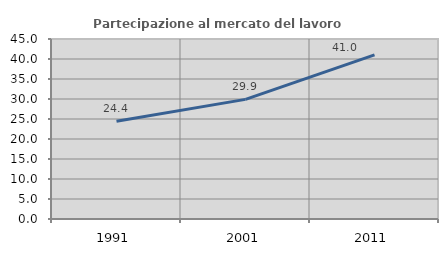
| Category | Partecipazione al mercato del lavoro  femminile |
|---|---|
| 1991.0 | 24.444 |
| 2001.0 | 29.907 |
| 2011.0 | 41.026 |